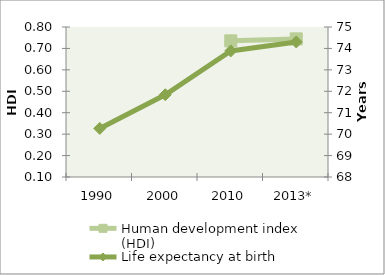
| Category | Human development index (HDI) |
|---|---|
| 1990 | 0 |
| 2000 | 0 |
| 2010 | 0.735 |
| 2013* | 0.745 |